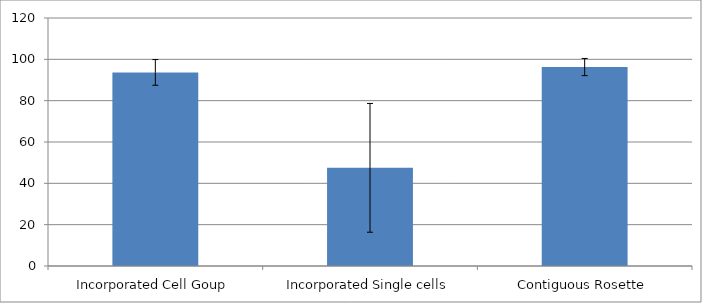
| Category | Series 0 |
|---|---|
| Incorporated Cell Goup | 93.672 |
| Incorporated Single cells | 47.5 |
| Contiguous Rosette | 96.272 |